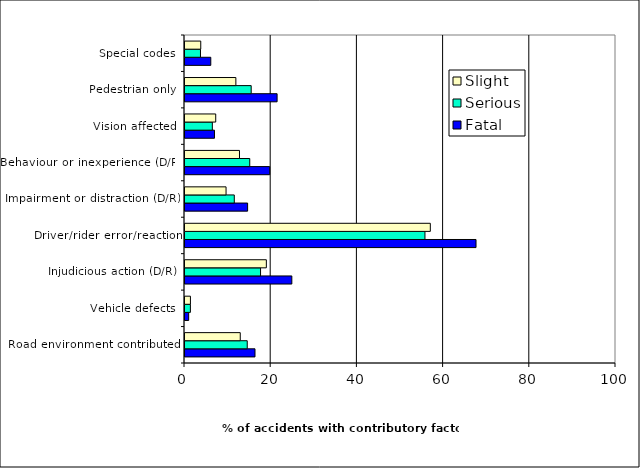
| Category | Fatal | Serious | Slight |
|---|---|---|---|
| Road environment contributed | 16.239 | 14.441 | 12.822 |
| Vehicle defects | 0.855 | 1.252 | 1.258 |
| Injudicious action (D/R) | 24.786 | 17.529 | 18.874 |
| Driver/rider error/reaction | 67.521 | 55.676 | 56.92 |
| Impairment or distraction (D/R) | 14.53 | 11.436 | 9.527 |
| Behaviour or inexperience (D/R) | 19.658 | 15.025 | 12.642 |
| Vision affected | 6.838 | 6.344 | 7.13 |
| Pedestrian only | 21.368 | 15.359 | 11.803 |
| Special codes | 5.983 | 3.589 | 3.655 |